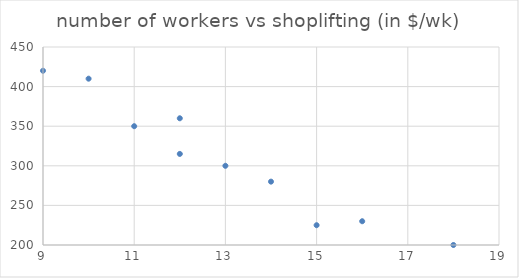
| Category | Loss |
|---|---|
| 9.0 | 420 |
| 11.0 | 350 |
| 12.0 | 360 |
| 13.0 | 300 |
| 15.0 | 225 |
| 18.0 | 200 |
| 16.0 | 230 |
| 14.0 | 280 |
| 12.0 | 315 |
| 10.0 | 410 |